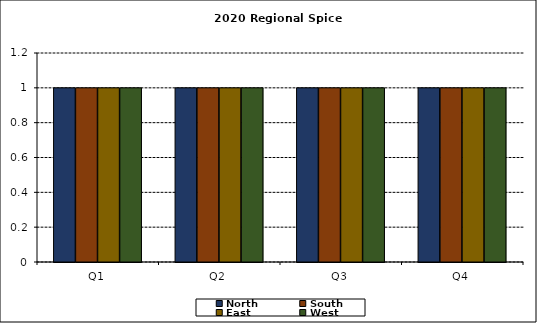
| Category | North | South | East | West |
|---|---|---|---|---|
| Q1 | 1 | 1 | 1 | 1 |
| Q2 | 1 | 1 | 1 | 1 |
| Q3 | 1 | 1 | 1 | 1 |
| Q4 | 1 | 1 | 1 | 1 |